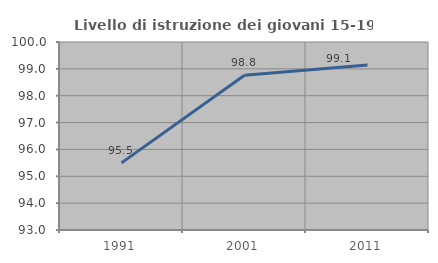
| Category | Livello di istruzione dei giovani 15-19 anni |
|---|---|
| 1991.0 | 95.498 |
| 2001.0 | 98.76 |
| 2011.0 | 99.142 |